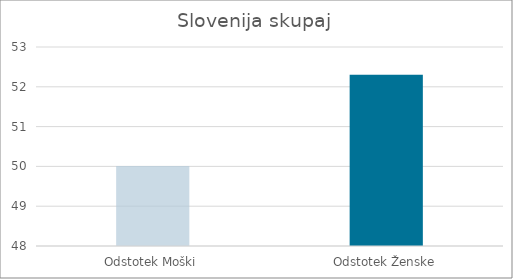
| Category | Series 0 |
|---|---|
| Odstotek Moški | 50.01 |
| Odstotek Ženske | 52.3 |